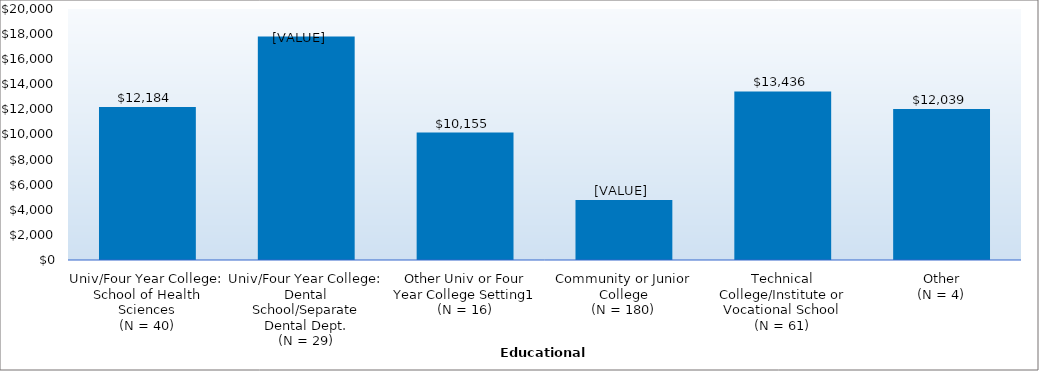
| Category | Series 0 |
|---|---|
| Univ/Four Year College: School of Health Sciences
(N = 40) | 12184 |
| Univ/Four Year College: Dental School/Separate Dental Dept.
(N = 29) | 17814.28 |
| Other Univ or Four Year College Setting1
(N = 16) | 10155 |
| Community or Junior College
(N = 180) | 4789 |
| Technical College/Institute or Vocational School
(N = 61) | 13436 |
| Other
(N = 4) | 12039 |